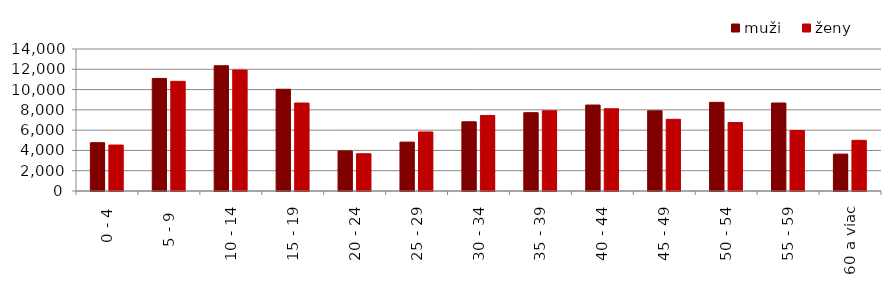
| Category | muži | ženy |
|---|---|---|
| 0 - 4 | 4763.25 | 4532.167 |
| 5 - 9  | 11096.917 | 10810.833 |
| 10 - 14 | 12348.917 | 11926.25 |
| 15 - 19 | 10030.917 | 8675.833 |
| 20 - 24 | 3954.917 | 3672.667 |
| 25 - 29 | 4820.833 | 5821 |
| 30 - 34 | 6824.333 | 7446.5 |
| 35 - 39 | 7722.417 | 7909.583 |
| 40 - 44 | 8474.583 | 8107.75 |
| 45 - 49 | 7902.917 | 7071.083 |
| 50 - 54 | 8741.417 | 6751.417 |
| 55 - 59 | 8675.417 | 5962 |
| 60 a viac | 3637.167 | 4995.75 |